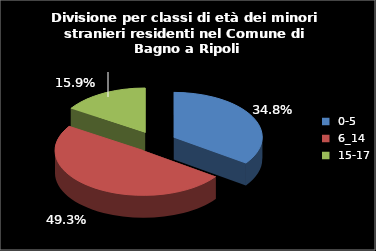
| Category | Series 0 | Series 1 |
|---|---|---|
| 0-5 | 125 |  |
| 6_14 | 177 |  |
| 15-17 | 57 |  |